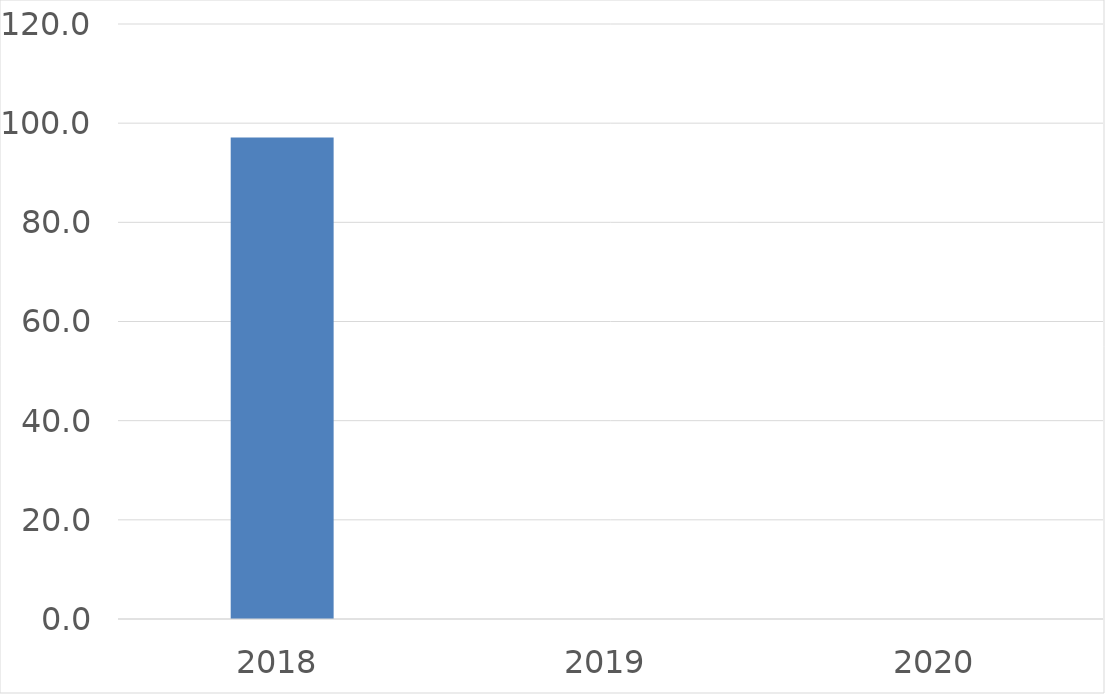
| Category | Series 0 |
|---|---|
| 2018 | 97.1 |
| 2019 | 0 |
| 2020 | 0 |